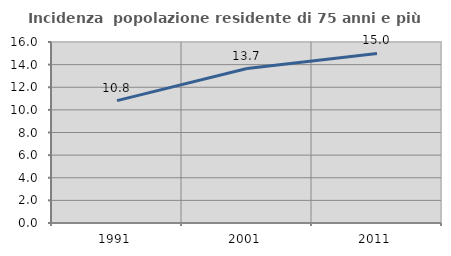
| Category | Incidenza  popolazione residente di 75 anni e più |
|---|---|
| 1991.0 | 10.817 |
| 2001.0 | 13.654 |
| 2011.0 | 14.987 |